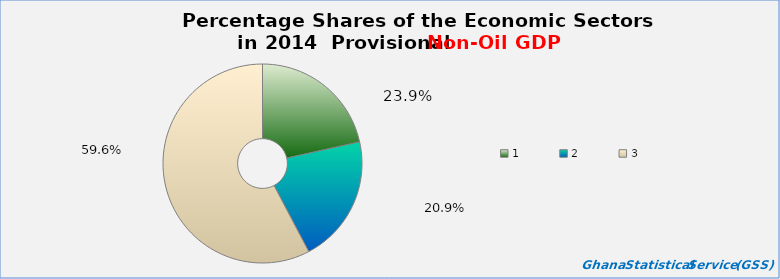
| Category | Series 0 |
|---|---|
| 0 | 21.519 |
| 1 | 20.784 |
| 2 | 57.697 |